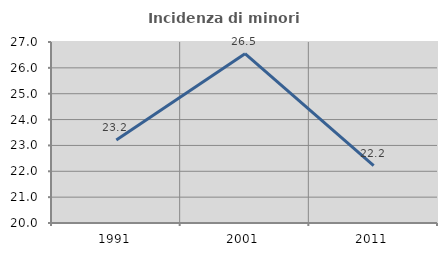
| Category | Incidenza di minori stranieri |
|---|---|
| 1991.0 | 23.214 |
| 2001.0 | 26.549 |
| 2011.0 | 22.222 |